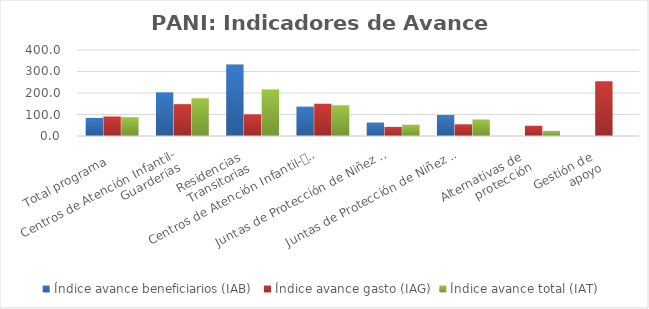
| Category | Índice avance beneficiarios (IAB)  | Índice avance gasto (IAG) | Índice avance total (IAT)  |
|---|---|---|---|
| Total programa | 84.162 | 90.81 | 87.486 |
| Centros de Atención Infantil-
Guarderías | 202.983 | 148.087 | 175.535 |
| Residencias 
Transitorias | 332.5 | 100.925 | 216.713 |
| Centros de Atención Infantil-
Guarderías Red de Cuido Directo | 136.46 | 149.968 | 143.214 |
| Juntas de Protección de Niñez y 
Adolescencia-Promoción | 62.386 | 42.41 | 52.398 |
| Juntas de Protección de Niñez y
 Adolescencia-Prevención | 97.652 | 54.406 | 76.029 |
| Alternativas de 
protección | 0 | 47.609 | 23.805 |
| Gestión de 
apoyo | 0 | 255.031 | 0 |